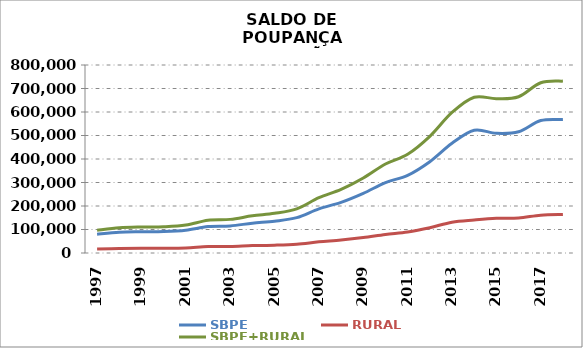
| Category | SBPE | RURAL | SBPE+RURAL |
|---|---|---|---|
| 1997 | 80250.377 | 16813.562 | 97063.939 |
| 1998 | 88538.349 | 18883.24 | 107421.589 |
| 1999 | 90437.74 | 20294.123 | 110731.863 |
| 2000 | 91430.45 | 20310.891 | 111741.341 |
| 2001 | 97146.25 | 21552.598 | 118698.848 |
| 2002 | 112423.444 | 27219.068 | 139642.512 |
| 2003 | 115258.021 | 27799.406 | 143057.427 |
| 2004 | 126853.217 | 31413.354 | 158266.571 |
| 2005 | 135411.681 | 33322.74 | 168734.421 |
| 2006 | 150412.546 | 37523.193 | 187935.739 |
| 2007 | 187827.264 | 47434.388 | 235261.652 |
| 2008 | 215400.282 | 54995.458 | 270395.74 |
| 2009 | 253604.98 | 65477.998 | 319082.978 |
| 2010 | 299878.217 | 78920.574 | 378798.791 |
| 2011 | 330569.272 | 89439.722 | 420008.994 |
| 2012 | 388641.662 | 107660.772 | 496302.434 |
| 2013 | 466788.644 | 131154.416 | 597943.06 |
| 2014 | 522343.501 | 140383.609 | 662727.11 |
| 2015 | 509223.044 | 147366.727 | 656589.771 |
| 2016 | 515955.43 | 149036.994 | 664992.424 |
| 2017 | 563741.675 | 160861.771 | 724603.446 |
| 2018* | 567815.814 | 163592.63 | 731408.444 |